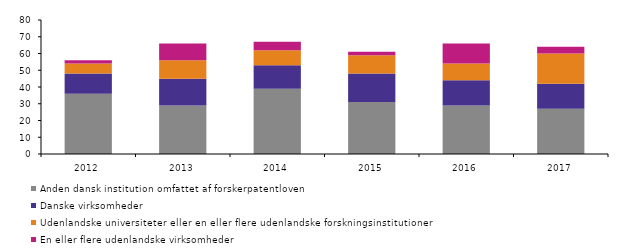
| Category | Anden dansk institution omfattet af forskerpatentloven | Danske virksomheder | Udenlandske universiteter eller en eller flere udenlandske forskningsinstitutioner | En eller flere udenlandske virksomheder |
|---|---|---|---|---|
| 2012.0 | 36 | 12 | 6 | 2 |
| 2013.0 | 29 | 16 | 11 | 10 |
| 2014.0 | 39 | 14 | 9 | 5 |
| 2015.0 | 31 | 17 | 11 | 2 |
| 2016.0 | 29 | 15 | 10 | 12 |
| 2017.0 | 27 | 15 | 18 | 4 |